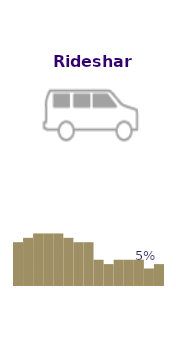
| Category | Rideshare |
|---|---|
| 1989.0 | 10 |
| 1992.0 | 11 |
| 1994.0 | 12 |
| 1996.0 | 12 |
| 1998.0 | 12 |
| 2000.0 | 11 |
| 2002.0 | 10 |
| 2004.0 | 10 |
| 2006.0 | 6 |
| 2008.0 | 5 |
| 2010.0 | 6 |
| 2012.0 | 6 |
| 2014.0 | 6 |
| 2015.0 | 4 |
| 2016.0 | 5 |